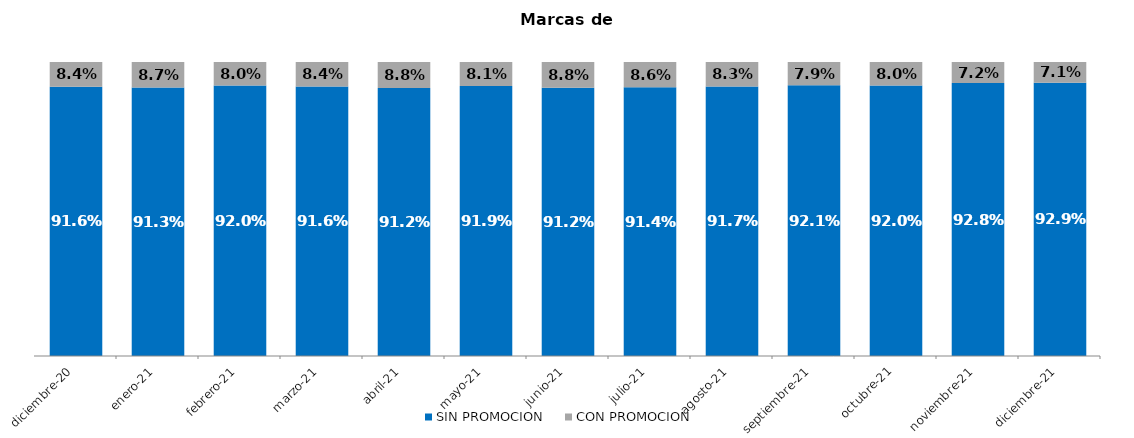
| Category | SIN PROMOCION   | CON PROMOCION   |
|---|---|---|
| 2020-12-01 | 0.916 | 0.084 |
| 2021-01-01 | 0.913 | 0.087 |
| 2021-02-01 | 0.92 | 0.08 |
| 2021-03-01 | 0.916 | 0.084 |
| 2021-04-01 | 0.912 | 0.088 |
| 2021-05-01 | 0.919 | 0.081 |
| 2021-06-01 | 0.912 | 0.088 |
| 2021-07-01 | 0.914 | 0.086 |
| 2021-08-01 | 0.917 | 0.083 |
| 2021-09-01 | 0.921 | 0.079 |
| 2021-10-01 | 0.92 | 0.08 |
| 2021-11-01 | 0.928 | 0.072 |
| 2021-12-01 | 0.929 | 0.071 |